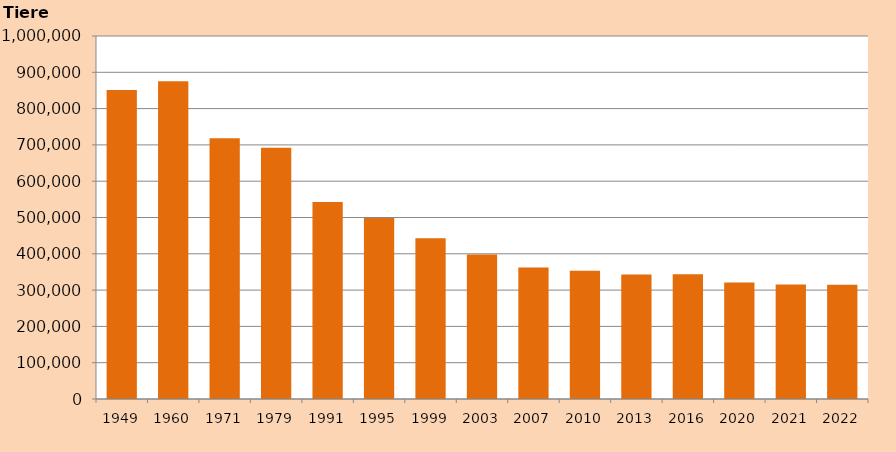
| Category | Tiere |
|---|---|
| 1949.0 | 851108 |
| 1960.0 | 875024 |
| 1971.0 | 718123 |
| 1979.0 | 691992 |
| 1991.0 | 543000 |
| 1995.0 | 498500 |
| 1999.0 | 443141 |
| 2003.0 | 398290 |
| 2007.0 | 362212 |
| 2010.0 | 353099 |
| 2013.0 | 342635 |
| 2016.0 | 343720 |
| 2020.0 | 320852 |
| 2021.0 | 315337 |
| 2022.0 | 314796 |